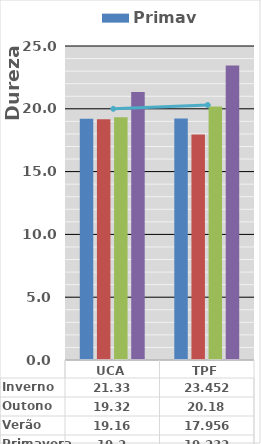
| Category | Primavera | Verão | Outono | Inverno |
|---|---|---|---|---|
| UCA | 19.2 | 19.16 | 19.32 | 21.33 |
| TPF | 19.232 | 17.956 | 20.18 | 23.452 |